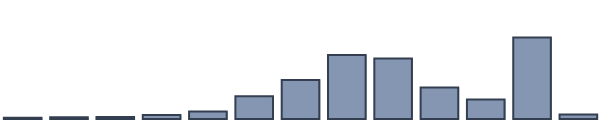
| Category | Series 0 |
|---|---|
| 0 | 0.4 |
| 1 | 0.5 |
| 2 | 0.6 |
| 3 | 1.2 |
| 4 | 2.2 |
| 5 | 6.7 |
| 6 | 11.5 |
| 7 | 18.8 |
| 8 | 17.8 |
| 9 | 9.3 |
| 10 | 5.7 |
| 11 | 24 |
| 12 | 1.3 |